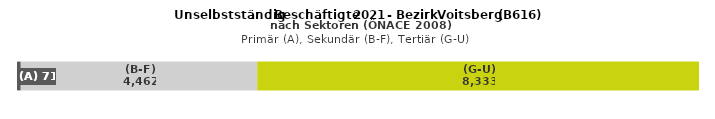
| Category | (A) | (B-F) | (G-U) |
|---|---|---|---|
| 0 | 71 | 4462 | 8333 |